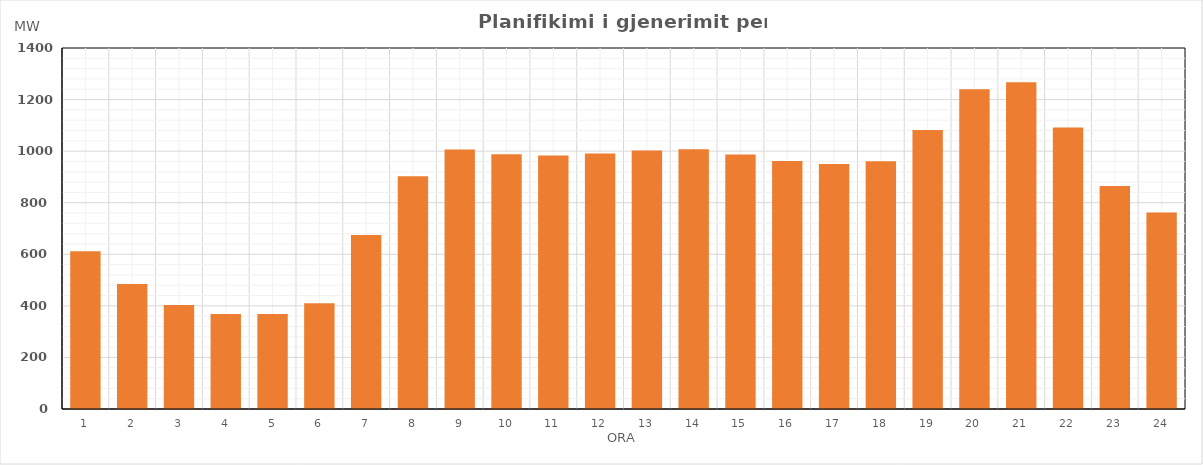
| Category | Max (MW) |
|---|---|
| 0 | 611.634 |
| 1 | 484.636 |
| 2 | 403.108 |
| 3 | 368.775 |
| 4 | 368.767 |
| 5 | 410.045 |
| 6 | 674.459 |
| 7 | 902.235 |
| 8 | 1005.925 |
| 9 | 988.4 |
| 10 | 982.952 |
| 11 | 990.4 |
| 12 | 1002.167 |
| 13 | 1007.199 |
| 14 | 987.021 |
| 15 | 961.869 |
| 16 | 949.743 |
| 17 | 960.796 |
| 18 | 1082.132 |
| 19 | 1240.303 |
| 20 | 1267.581 |
| 21 | 1091.928 |
| 22 | 864.523 |
| 23 | 761.731 |